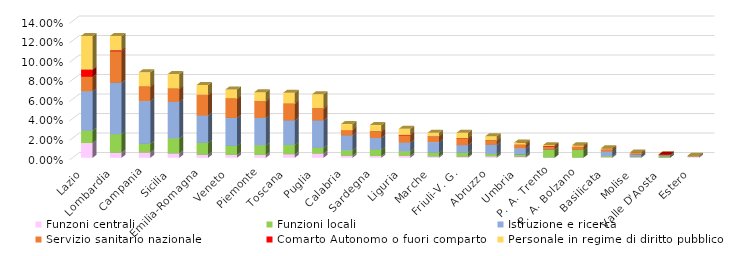
| Category | Funzoni centrali | Funzioni locali | Istruzione e ricerca | Servizio sanitario nazionale | Comarto Autonomo o fuori comparto | Personale in regime di diritto pubblico |
|---|---|---|---|---|---|---|
| Lazio | 0.015 | 0.013 | 0.04 | 0.015 | 0.007 | 0.034 |
| Lombardia | 0.005 | 0.019 | 0.053 | 0.032 | 0.001 | 0.015 |
| Campania | 0.005 | 0.009 | 0.044 | 0.015 | 0 | 0.015 |
| Sicilia | 0.004 | 0.015 | 0.037 | 0.013 | 0 | 0.015 |
| Emilia-Romagna | 0.003 | 0.012 | 0.028 | 0.021 | 0 | 0.01 |
| Veneto | 0.003 | 0.009 | 0.029 | 0.019 | 0 | 0.009 |
| Piemonte | 0.003 | 0.01 | 0.028 | 0.017 | 0 | 0.009 |
| Toscana | 0.004 | 0.01 | 0.025 | 0.017 | 0 | 0.011 |
| Puglia | 0.004 | 0.006 | 0.028 | 0.012 | 0 | 0.015 |
| Calabria | 0.002 | 0.005 | 0.015 | 0.005 | 0 | 0.006 |
| Sardegna | 0.002 | 0.007 | 0.012 | 0.006 | 0 | 0.007 |
| Liguria | 0.002 | 0.005 | 0.009 | 0.007 | 0.001 | 0.006 |
| Marche | 0.001 | 0.004 | 0.011 | 0.006 | 0 | 0.003 |
| Friuli-V. G. | 0.001 | 0.004 | 0.008 | 0.006 | 0.001 | 0.006 |
| Abruzzo | 0.001 | 0.002 | 0.01 | 0.004 | 0 | 0.004 |
| Umbria | 0.001 | 0.002 | 0.006 | 0.004 | 0 | 0.002 |
| P. A. Trento | 0 | 0.008 | 0 | 0.003 | 0.001 | 0.001 |
| P. A. Bolzano | 0 | 0.008 | 0 | 0.003 | 0 | 0.002 |
| Basilicata | 0.001 | 0.001 | 0.005 | 0.002 | 0 | 0.001 |
| Molise | 0 | 0.001 | 0.002 | 0.001 | 0 | 0.001 |
| Valle D'Aosta  | 0 | 0.001 | 0.001 | 0.001 | 0 | 0 |
| Estero | 0.001 | 0 | 0 | 0 | 0 | 0.001 |